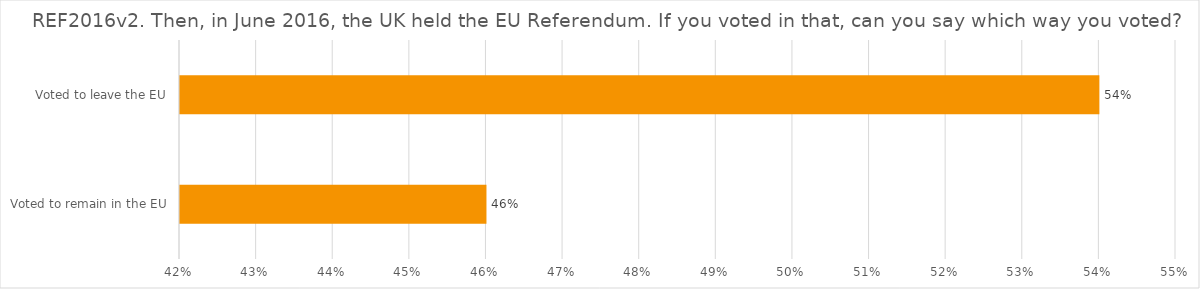
| Category | REF2016v2. Then, in June 2016, the UK held the EU Referendum. If you voted in that, can you say which way you voted? |
|---|---|
| Voted to remain in the EU | 0.46 |
| Voted to leave the EU | 0.54 |